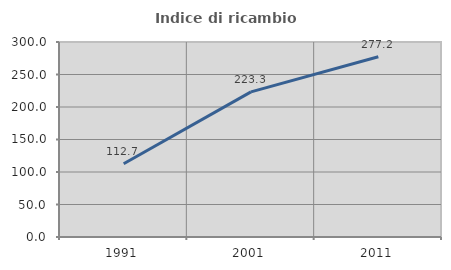
| Category | Indice di ricambio occupazionale  |
|---|---|
| 1991.0 | 112.692 |
| 2001.0 | 223.269 |
| 2011.0 | 277.206 |